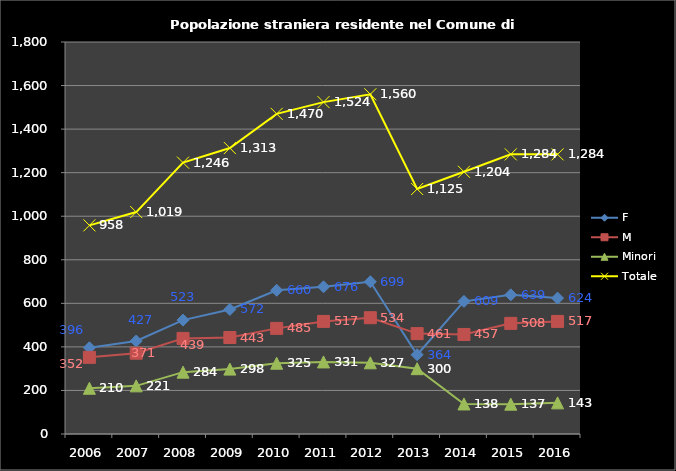
| Category | F | M | Minori | Totale |
|---|---|---|---|---|
| 2006.0 | 396 | 352 | 210 | 958 |
| 2007.0 | 427 | 371 | 221 | 1019 |
| 2008.0 | 523 | 439 | 284 | 1246 |
| 2009.0 | 572 | 443 | 298 | 1313 |
| 2010.0 | 660 | 485 | 325 | 1470 |
| 2011.0 | 676 | 517 | 331 | 1524 |
| 2012.0 | 699 | 534 | 327 | 1560 |
| 2013.0 | 364 | 461 | 300 | 1125 |
| 2014.0 | 609 | 457 | 138 | 1204 |
| 2015.0 | 639 | 508 | 137 | 1284 |
| 2016.0 | 624 | 517 | 143 | 1284 |